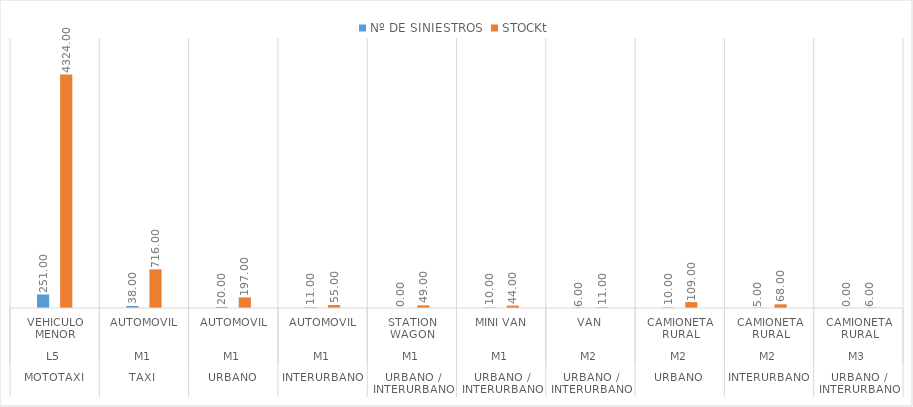
| Category | Nº DE SINIESTROS | STOCKt |
|---|---|---|
| 0 | 251 | 4324 |
| 1 | 38 | 716 |
| 2 | 20 | 197 |
| 3 | 11 | 55 |
| 4 | 0 | 49 |
| 5 | 10 | 44 |
| 6 | 6 | 11 |
| 7 | 10 | 109 |
| 8 | 5 | 68 |
| 9 | 0 | 6 |